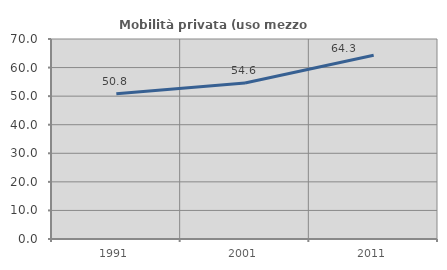
| Category | Mobilità privata (uso mezzo privato) |
|---|---|
| 1991.0 | 50.797 |
| 2001.0 | 54.626 |
| 2011.0 | 64.323 |